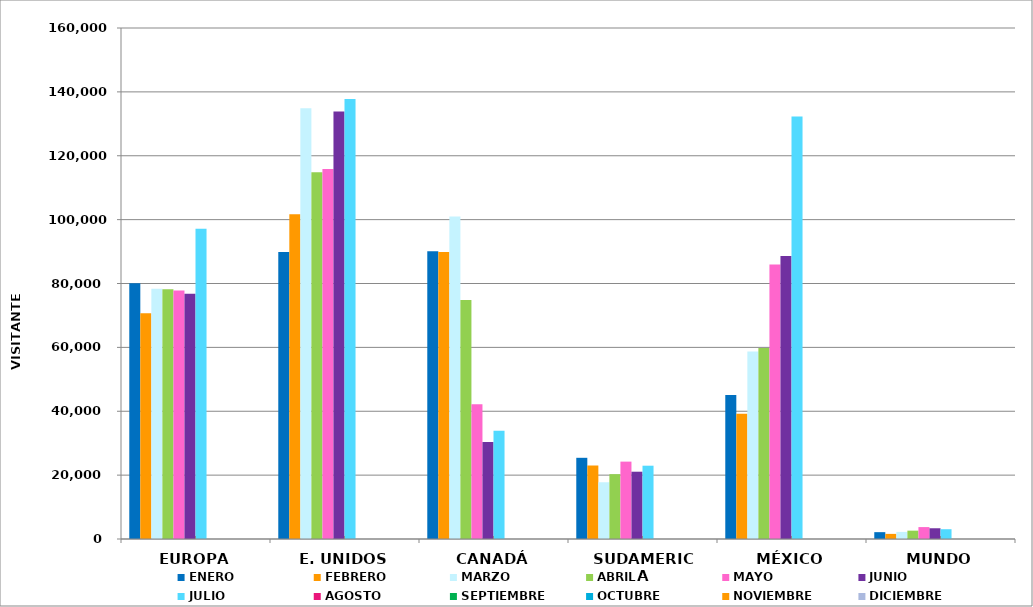
| Category | ENERO | FEBRERO | MARZO | ABRIL | MAYO | JUNIO | JULIO | AGOSTO | SEPTIEMBRE | OCTUBRE | NOVIEMBRE | DICIEMBRE |
|---|---|---|---|---|---|---|---|---|---|---|---|---|
| EUROPA | 80085 | 70666 | 78329 | 78183 | 77835 | 76823 | 97166 |  |  |  |  |  |
| E. UNIDOS | 89850 | 101692 | 134892 | 114837 | 115835 | 133819 | 137782 |  |  |  |  |  |
| CANADÁ | 90095 | 89828 | 100975 | 74825 | 42209 | 30352 | 33911 |  |  |  |  |  |
| SUDAMERICA | 25423 | 23012 | 17763 | 20309 | 24229 | 21069 | 22951 |  |  |  |  |  |
| MÉXICO | 45101 | 39217 | 58678 | 59804 | 85925 | 88609 | 132262 |  |  |  |  |  |
| MUNDO | 2144 | 1602 | 2215 | 2614 | 3731 | 3362 | 3065 |  |  |  |  |  |